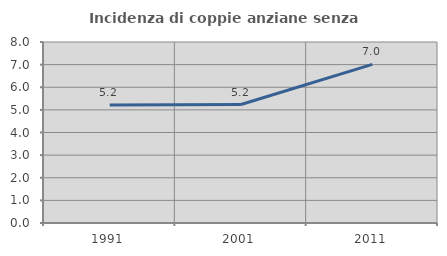
| Category | Incidenza di coppie anziane senza figli  |
|---|---|
| 1991.0 | 5.22 |
| 2001.0 | 5.236 |
| 2011.0 | 7.014 |